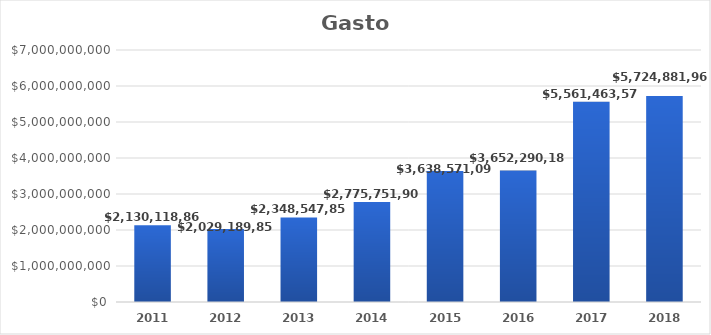
| Category | Series 0 |
|---|---|
| 2011.0 | 2130118862 |
| 2012.0 | 2029189858 |
| 2013.0 | 2348547856 |
| 2014.0 | 2775751908 |
| 2015.0 | 3638571092 |
| 2016.0 | 3652290186 |
| 2017.0 | 5561463572.87 |
| 2018.0 | 5724881963 |